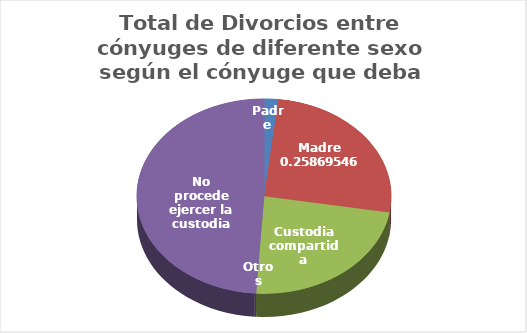
| Category | Series 0 |
|---|---|
| Padre | 1434 |
| Madre | 20580 |
| Custodia compartida | 18533 |
| Otros | 148 |
| No procede ejercer la custodia | 38858 |